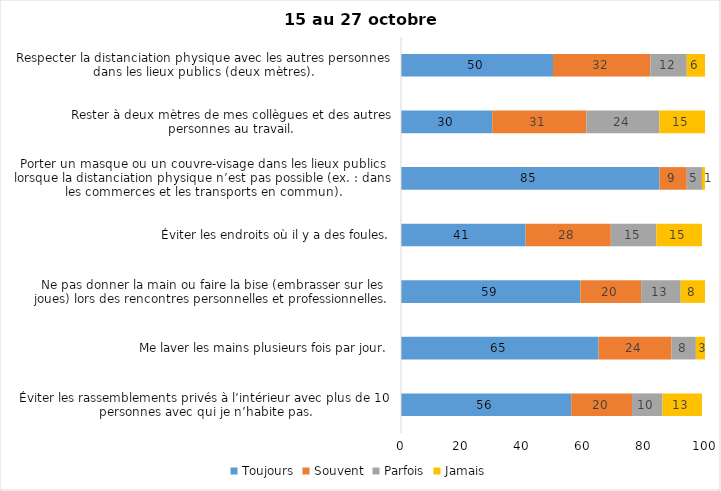
| Category | Toujours | Souvent | Parfois | Jamais |
|---|---|---|---|---|
| Éviter les rassemblements privés à l’intérieur avec plus de 10 personnes avec qui je n’habite pas. | 56 | 20 | 10 | 13 |
| Me laver les mains plusieurs fois par jour. | 65 | 24 | 8 | 3 |
| Ne pas donner la main ou faire la bise (embrasser sur les joues) lors des rencontres personnelles et professionnelles. | 59 | 20 | 13 | 8 |
| Éviter les endroits où il y a des foules. | 41 | 28 | 15 | 15 |
| Porter un masque ou un couvre-visage dans les lieux publics lorsque la distanciation physique n’est pas possible (ex. : dans les commerces et les transports en commun). | 85 | 9 | 5 | 1 |
| Rester à deux mètres de mes collègues et des autres personnes au travail. | 30 | 31 | 24 | 15 |
| Respecter la distanciation physique avec les autres personnes dans les lieux publics (deux mètres). | 50 | 32 | 12 | 6 |